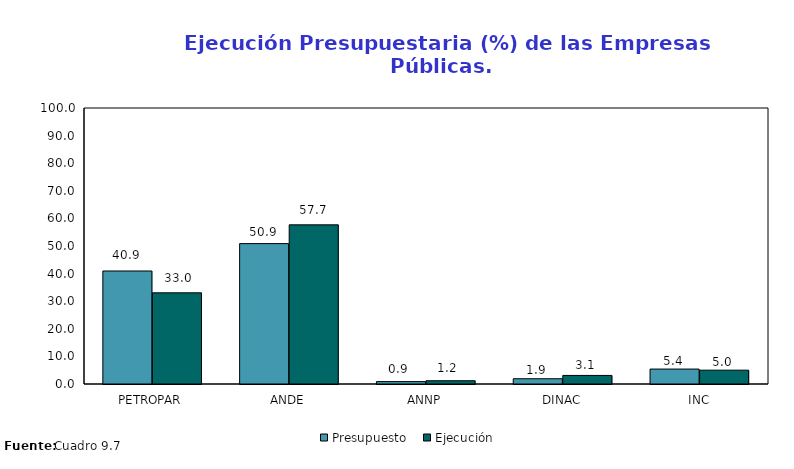
| Category | Presupuesto | Ejecución |
|---|---|---|
| PETROPAR | 40.946 | 33.036 |
| ANDE | 50.865 | 57.67 |
| ANNP | 0.866 | 1.18 |
| DINAC | 1.911 | 3.106 |
| INC | 5.411 | 5.008 |